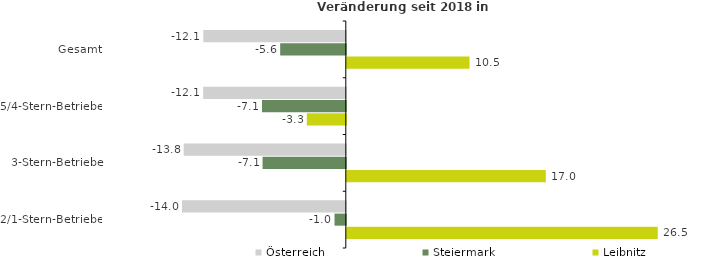
| Category | Österreich | Steiermark | Leibnitz |
|---|---|---|---|
| Gesamt | -12.137 | -5.59 | 10.453 |
| 5/4-Stern-Betriebe | -12.15 | -7.138 | -3.322 |
| 3-Stern-Betriebe | -13.805 | -7.09 | 16.953 |
| 2/1-Stern-Betriebe | -13.951 | -0.963 | 26.488 |